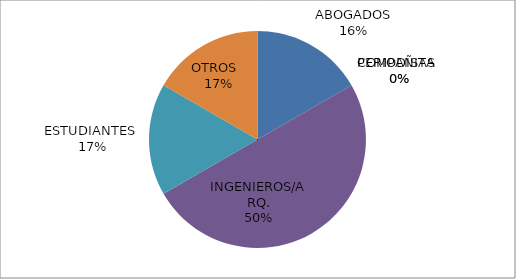
| Category | Series 0 |
|---|---|
| ABOGADOS | 1 |
| PERIODISTA  | 0 |
| COMPAÑIAS  | 0 |
| INGENIEROS/ARQ. | 3 |
| ESTUDIANTES  | 1 |
| OTROS   | 1 |